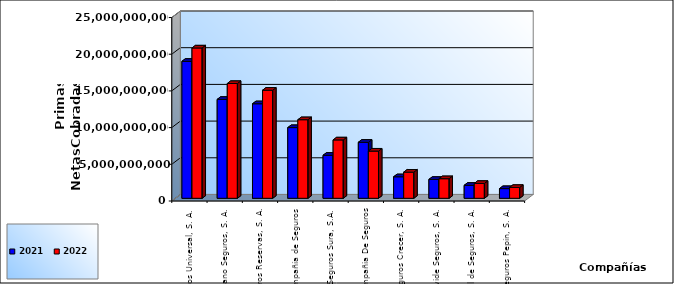
| Category | 2021 | 2022 |
|---|---|---|
| Seguros Universal, S. A. | 18662874680.48 | 20485663368.82 |
| Humano Seguros, S. A. | 13479325806.91 | 15641511616.34 |
| Seguros Reservas, S. A. | 12882140071.51 | 14729076628.46 |
| Mapfre BHD Compañía de Seguros | 9636184501.08 | 10709268449.25 |
| Seguros Sura, S.A. | 5862815996.36 | 7955663374.3 |
| La Colonial, S. A., Compañia De Seguros | 7632385113.55 | 6433300316.94 |
| Seguros Crecer, S. A. | 2934516900.54 | 3562391832.69 |
| Worldwide Seguros, S. A. | 2575819623.42 | 2672314441.45 |
| General de Seguros, S. A. | 1768413780.57 | 2026072517.38 |
| Seguros Pepín, S. A. | 1321072991.36 | 1479526195.26 |